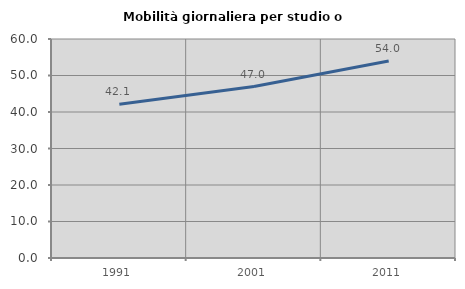
| Category | Mobilità giornaliera per studio o lavoro |
|---|---|
| 1991.0 | 42.145 |
| 2001.0 | 46.964 |
| 2011.0 | 53.974 |